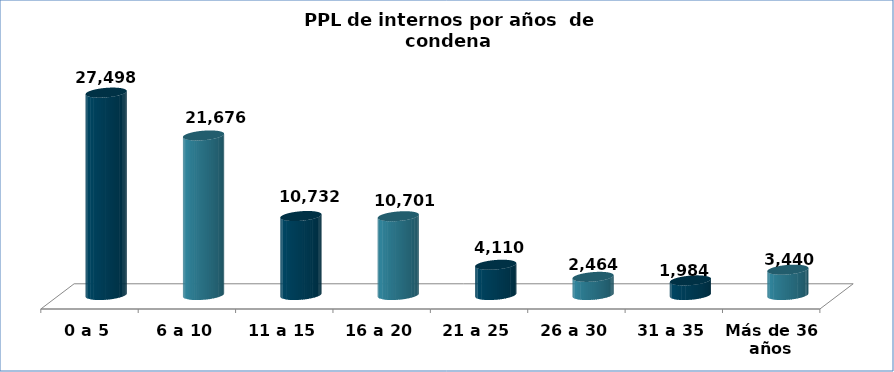
| Category | Series 0 |
|---|---|
| 0 a 5 | 27498 |
| 6 a 10 | 21676 |
| 11 a 15 | 10732 |
| 16 a 20 | 10701 |
| 21 a 25 | 4110 |
| 26 a 30 | 2464 |
| 31 a 35 | 1984 |
| Más de 36 años | 3440 |